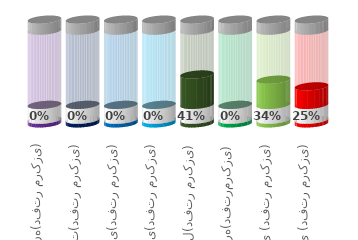
| Category | Series 0 | Series 1 | Series 2 | Series 3 | Series 4 |
|---|---|---|---|---|---|
| آشپزخانه(دفتر مرکزی) | 0.05 | 0.2 | 0 | 1 | 0.15 |
| تدارکات(دفتر مرکزی) | 0.05 | 0.2 | 0 | 1 | 0.15 |
| بازرگانی(دفتر مرکزی) | 0.05 | 0.2 | 0 | 1 | 0.15 |
| فنی(دفتر مرکزی) | 0.05 | 0.2 | 0 | 1 | 0.15 |
| مدیریت عامل(دفتر مرکزی) | 0.05 | 0.2 | 0.41 | 0.59 | 0.15 |
| هیئت مدیره(دفترمرکزی) | 0.05 | 0.2 | 0 | 1 | 0.15 |
| مالی (دفتر مرکزی) | 0.05 | 0.2 | 0.34 | 0.66 | 0.15 |
| اداری (دفتر مرکزی) | 0.05 | 0.2 | 0.25 | 0.75 | 0.15 |